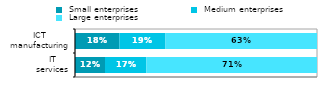
| Category |  Small enterprises |  Medium enterprises |  Large enterprises |
|---|---|---|---|
|  IT 
services | 0.124 | 0.171 | 0.705 |
|  ICT 
manufacturing | 0.184 | 0.19 | 0.626 |